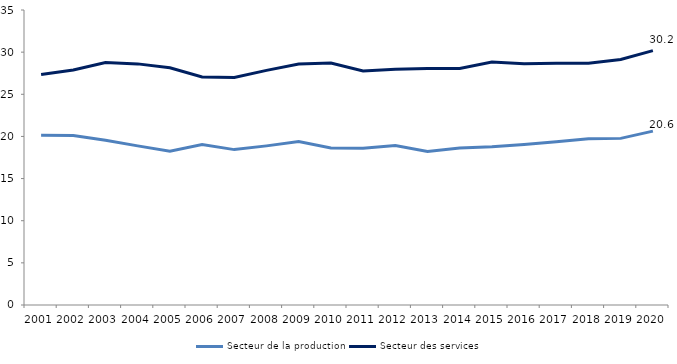
| Category | Secteur de la production | Secteur des services |
|---|---|---|
| 2001.0 | 20.139 | 27.339 |
| 2002.0 | 20.101 | 27.886 |
| 2003.0 | 19.535 | 28.776 |
| 2004.0 | 18.881 | 28.607 |
| 2005.0 | 18.237 | 28.137 |
| 2006.0 | 19.05 | 27.053 |
| 2007.0 | 18.436 | 27.005 |
| 2008.0 | 18.88 | 27.834 |
| 2009.0 | 19.404 | 28.58 |
| 2010.0 | 18.619 | 28.712 |
| 2011.0 | 18.592 | 27.769 |
| 2012.0 | 18.924 | 27.979 |
| 2013.0 | 18.218 | 28.046 |
| 2014.0 | 18.617 | 28.062 |
| 2015.0 | 18.787 | 28.829 |
| 2016.0 | 19.056 | 28.614 |
| 2017.0 | 19.382 | 28.671 |
| 2018.0 | 19.735 | 28.685 |
| 2019.0 | 19.769 | 29.135 |
| 2020.0 | 20.626 | 30.181 |